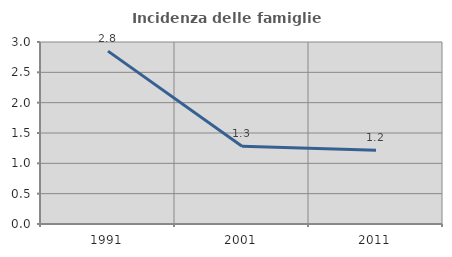
| Category | Incidenza delle famiglie numerose |
|---|---|
| 1991.0 | 2.85 |
| 2001.0 | 1.28 |
| 2011.0 | 1.215 |